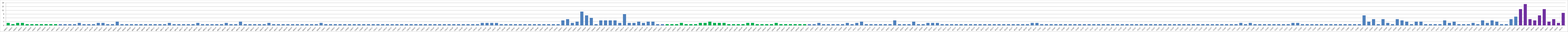
| Category | Series 0 |
|---|---|
| AW01 | 2 |
| AW02 | 1 |
| AW03 | 2 |
| AW04 | 2 |
| AW05 | 1 |
| AW06 | 1 |
| AW07 | 1 |
| AW08 | 1 |
| AW09 | 1 |
| AW10 | 1 |
| AW11 | 1 |
| AW12 | 1 |
| AW13 | 1 |
| AW14 | 1 |
| AW15 | 1 |
| AW16 | 2 |
| AW17 | 1 |
| AW18 | 1 |
| AW19 | 1 |
| AW20 | 2 |
| AW21 | 2 |
| BW01 | 1 |
| BW02 | 1 |
| BW03 | 3 |
| BWO4 | 1 |
| BW05 | 1 |
| BW06 | 1 |
| BW07 | 1 |
| BW08 | 1 |
| BW09 | 1 |
| BW10 | 1 |
| BW11 | 1 |
| BW12 | 1 |
| BW13 | 1 |
| BW14 | 2 |
| BW15 | 1 |
| BW16 | 1 |
| BW17 | 1 |
| BW18 | 1 |
| BW19 | 1 |
| BW20 | 2 |
| BW21 | 1 |
| BW22 | 1 |
| BW23 | 1 |
| BW24 | 1 |
| BW25 | 1 |
| BW26 | 2 |
| BW27 | 1 |
| BW28 | 1 |
| BW29 | 3 |
| BW30 | 1 |
| BW31 | 1 |
| BW32 | 1 |
| BW33 | 1 |
| BW34 | 1 |
| BW35 | 2 |
| BW36 | 1 |
| BW37 | 1 |
| BW38 | 1 |
| BW39 | 1 |
| BW40 | 1 |
| BW41 | 1 |
| BW42 | 1 |
| BW43 | 1 |
| BW44 | 1 |
| BW45 | 1 |
| BW46 | 2 |
| CW01 | 1 |
| CW02 | 1 |
| CW03 | 1 |
| CW04 | 1 |
| CW05 | 1 |
| CW06 | 1 |
| CW07 | 1 |
| CW08 | 1 |
| CW09 | 1 |
| CW10 | 1 |
| CW11 | 1 |
| CW12 | 1 |
| CW13 | 1 |
| CW14 | 1 |
| CW15 | 1 |
| CW16 | 1 |
| CW17 | 1 |
| CW18 | 1 |
| CW19 | 1 |
| CW20 | 1 |
| CW21 | 1 |
| CW22 | 1 |
| CW23 | 1 |
| CW24 | 1 |
| CW25 | 1 |
| CW26 | 1 |
| CW27 | 1 |
| CW28 | 1 |
| CW29 | 1 |
| CW30 | 1 |
| CW31 | 1 |
| CW32 | 1 |
| CW33 | 1 |
| CW34 | 2 |
| CW35 | 2 |
| CW36 | 2 |
| CW37 | 2 |
| CW38 | 1 |
| CW39 | 1 |
| CW40 | 1 |
| CW41 | 1 |
| CW42 | 1 |
| CW43 | 1 |
| CW44 | 1 |
| CW45 | 1 |
| CW46 | 1 |
| CW47 | 1 |
| CW48 | 1 |
| CW49 | 1 |
| CW50 | 1 |
| DW01 | 4 |
| DW02 | 5 |
| DW03 | 2 |
| DW04 | 3 |
| DW05 | 11 |
| DW06 | 8 |
| DW07 | 6 |
| DW08 | 1 |
| DW09 | 4 |
| DW10 | 4 |
| DW11 | 4 |
| DW12 | 4 |
| DW13 | 2 |
| DW14 | 9 |
| DW15 | 2 |
| DW16 | 2 |
| DW17 | 3 |
| DW18 | 2 |
| DW19 | 3 |
| DW20 | 3 |
| DW21 | 1 |
| DW22 | 1 |
| DW23 | 1 |
| DW24 | 1 |
| DW25 | 1 |
| DW26 | 2 |
| DW27 | 1 |
| DW28 | 1 |
| DW29 | 1 |
| DW30 | 2 |
| DW31 | 2 |
| DW32 | 3 |
| DW33 | 2 |
| DW34 | 2 |
| DW35 | 2 |
| DW36 | 1 |
| DW37 | 1 |
| DW38 | 1 |
| DW39 | 1 |
| DW40 | 2 |
| DW40 | 2 |
| DW41 | 1 |
| DW42 | 1 |
| DW43 | 1 |
| DW44 | 1 |
| DW45 | 2 |
| DW46 | 1 |
| DW47 | 1 |
| DW48 | 1 |
| DW49 | 1 |
| DW50 | 1 |
| DW51 | 1 |
| AU01 | 1 |
| AU02 | 1 |
| AU03 | 2 |
| AU04 | 1 |
| AU05 | 1 |
| AU06 | 1 |
| AU07 | 1 |
| AU08 | 1 |
| AU09 | 2 |
| AU10 | 1 |
| AU11 | 2 |
| AU12 | 3 |
| AU13 | 1 |
| AU14 | 1 |
| AU15 | 1 |
| AU16 | 1 |
| AU17 | 1 |
| BU01 | 1 |
| BU02 | 4 |
| BU03 | 1 |
| BU04 | 1 |
| BU05 | 1 |
| BU06 | 3 |
| BU07 | 1 |
| BU08 | 1 |
| BU09 | 2 |
| BU10 | 2 |
| BU11 | 2 |
| BU12 | 1 |
| BU13 | 1 |
| BU14 | 1 |
| BU15 | 1 |
| BU16 | 1 |
| BU17 | 1 |
| BU18 | 1 |
| BU19 | 1 |
| BU20 | 1 |
| BU21 | 1 |
| BU22 | 1 |
| BU23 | 1 |
| BU24 | 1 |
| BU25 | 1 |
| BU26 | 1 |
| BU27 | 1 |
| BU28 | 1 |
| BU29 | 1 |
| BU30 | 1 |
| BU32 | 2 |
| BU33 | 2 |
| CU01 | 1 |
| CU02 | 1 |
| CU03 | 1 |
| CU04 | 1 |
| CU05 | 1 |
| CU06 | 1 |
| CU07 | 1 |
| CU08 | 1 |
| CU09 | 1 |
| CU10 | 1 |
| CU11 | 1 |
| CU12 | 1 |
| CU13 | 1 |
| CU14 | 1 |
| CU15 | 1 |
| CU16 | 1 |
| CU17 | 1 |
| CU18 | 1 |
| CU19 | 1 |
| CU20 | 1 |
| CU21 | 1 |
| CU22 | 1 |
| CU23 | 1 |
| CU24 | 1 |
| CU25 | 1 |
| CU26 | 1 |
| CU27 | 1 |
| CU28 | 1 |
| CU29 | 1 |
| CU30 | 1 |
| CU31 | 1 |
| CU32 | 1 |
| CU33 | 1 |
| CU34 | 1 |
| CU35 | 1 |
| CU36 | 1 |
| CU37 | 1 |
| CU38 | 1 |
| CU39 | 1 |
| CU40 | 1 |
| CU41 | 1 |
| CU42 | 1 |
| CU43 | 2 |
| CU44 | 1 |
| CU45 | 2 |
| CU46 | 1 |
| CU47 | 1 |
| CU48 | 1 |
| CU49 | 1 |
| CU50 | 1 |
| CU51 | 1 |
| CU52 | 1 |
| CU53 | 1 |
| CU54 | 2 |
| CU55 | 2 |
| CU56 | 1 |
| CU57 | 1 |
| CU58 | 1 |
| CU59 | 1 |
| CU60 | 1 |
| CU61 | 1 |
| CU62 | 1 |
| CU63 | 1 |
| CU64 | 1 |
| CU65 | 1 |
| CU66 | 1 |
| CU67 | 1 |
| CU68 | 1 |
| DU01 | 8 |
| DU02 | 3 |
| DU03 | 5 |
| DU04 | 1 |
| DU05 | 5 |
| DU06 | 2 |
| DU07 | 1 |
| DU08 | 5 |
| DU09 | 4 |
| DU10 | 3 |
| DU11 | 1 |
| DU12 | 3 |
| DU13 | 3 |
| DU14 | 1 |
| DU15 | 1 |
| DU16 | 1 |
| DU17 | 1 |
| DU18 | 4 |
| DU19 | 2 |
| DU20 | 3 |
| DU21 | 1 |
| DU22 | 1 |
| DU23 | 1 |
| DU24 | 2 |
| DU25 | 1 |
| DU26 | 4 |
| DU27 | 2 |
| DU28 | 4 |
| DU29 | 3 |
| DU30 | 1 |
| DU31 | 1 |
| DU32 | 5 |
| DU33 | 7 |
| DK01 | 13 |
| DK02 | 17 |
| DK03 | 5 |
| DK04 | 4 |
| DK05 | 8 |
| DK06 | 13 |
| DK07 | 3 |
| DK08 | 5 |
| DK09 | 2 |
| DK10 | 10 |